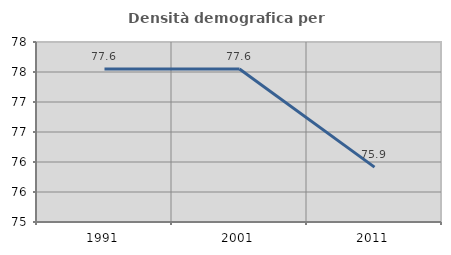
| Category | Densità demografica |
|---|---|
| 1991.0 | 77.551 |
| 2001.0 | 77.551 |
| 2011.0 | 75.914 |